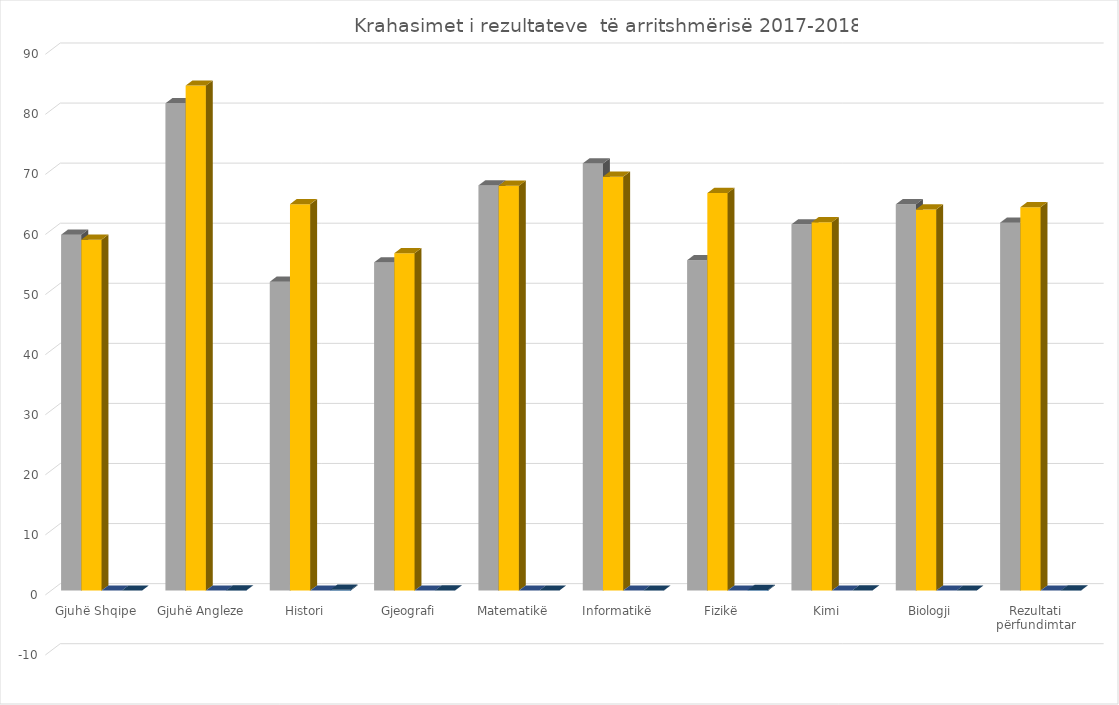
| Category | Series 2 | Series 3 | Series 4 | Series 6 |
|---|---|---|---|---|
| Gjuhë Shqipe | 59.24 | 58.42 | 0 | -0.008 |
| Gjuhë Angleze | 81.12 | 84.07 | 0 | 0.03 |
| Histori | 51.41 | 64.34 | 0 | 0.129 |
| Gjeografi | 54.64 | 56.17 | 0 | 0.015 |
| Matematikë | 67.45 | 67.39 | 0 | -0.001 |
| Informatikë | 71.12 | 68.91 | 0 | -0.022 |
| Fizikë | 55 | 66.18 | 0 | 0.112 |
| Kimi | 60.97 | 61.31 | 0 | 0.003 |
| Biologji | 64.31 | 63.46 | 0 | -0.008 |
| Rezultati përfundimtar | 61.25 | 63.83 | 0 | 0.026 |